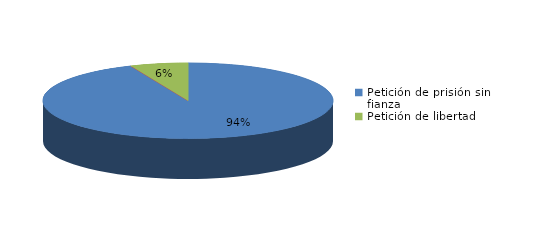
| Category | Series 0 |
|---|---|
| Petición de prisión sin fianza | 29 |
| Peticion de libertad con fianza | 0 |
| Petición de libertad | 2 |